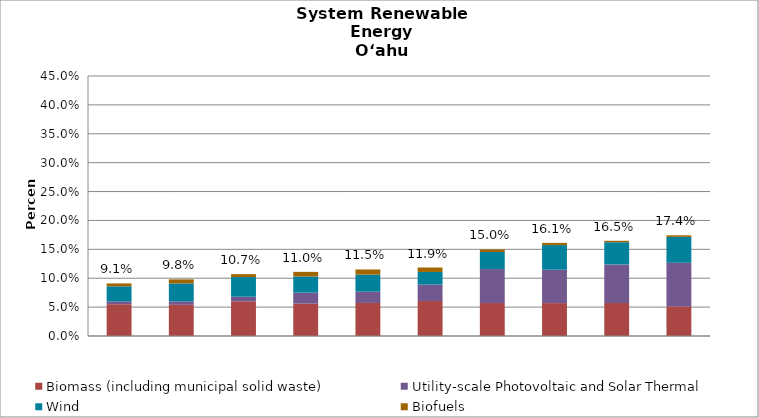
| Category | Biomass (including municipal solid waste) | Utility-scale Photovoltaic and Solar Thermal | Wind | Biofuels |
|---|---|---|---|---|
| 2014.0 | 0.055 | 0.005 | 0.026 | 0.005 |
| 2015.0 | 0.054 | 0.006 | 0.031 | 0.007 |
| 2016.0 | 0.06 | 0.008 | 0.034 | 0.005 |
| 2017.0 | 0.056 | 0.019 | 0.028 | 0.008 |
| 2018.0 | 0.057 | 0.019 | 0.029 | 0.009 |
| 2019.0 | 0.061 | 0.028 | 0.022 | 0.008 |
| 2020.0 | 0.057 | 0.059 | 0.03 | 0.004 |
| 2021.0 | 0.057 | 0.058 | 0.043 | 0.004 |
| 2022.0 | 0.057 | 0.067 | 0.038 | 0.003 |
| 2023.0 | 0.051 | 0.076 | 0.045 | 0.003 |